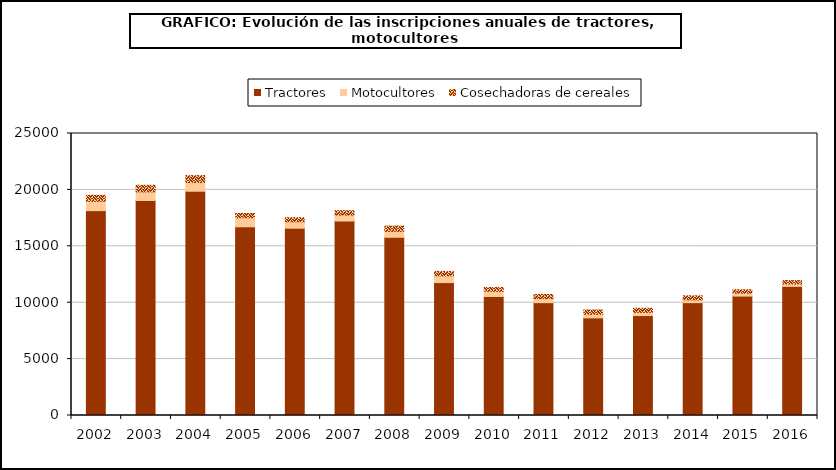
| Category | Tractores | Motocultores | Cosechadoras de cereales |
|---|---|---|---|
| 2002.0 | 18162 | 830 | 525 |
| 2003.0 | 19060 | 766 | 581 |
| 2004.0 | 19881 | 769 | 620 |
| 2005.0 | 16729 | 800 | 381 |
| 2006.0 | 16605 | 570 | 361 |
| 2007.0 | 17241 | 525 | 385 |
| 2008.0 | 15799 | 525 | 463 |
| 2009.0 | 11784 | 603 | 384 |
| 2010.0 | 10548 | 463 | 336 |
| 2011.0 | 10002 | 366 | 362 |
| 2012.0 | 8655 | 315 | 380 |
| 2013.0 | 8859 | 287 | 361 |
| 2014.0 | 10004 | 248 | 360 |
| 2015.0 | 10587 | 257 | 305 |
| 2016.0 | 11449 | 209 | 302 |